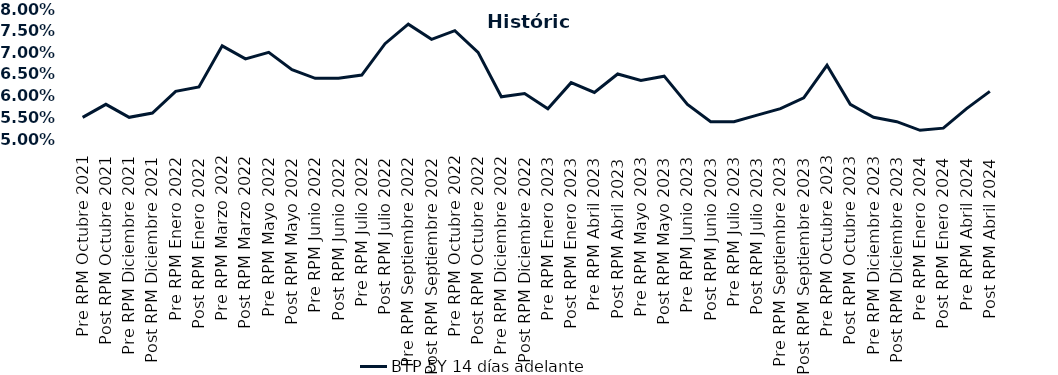
| Category | BTP 5Y 14 días adelante |
|---|---|
| Pre RPM Octubre 2021 | 0.055 |
| Post RPM Octubre 2021 | 0.058 |
| Pre RPM Diciembre 2021 | 0.055 |
| Post RPM Diciembre 2021 | 0.056 |
| Pre RPM Enero 2022 | 0.061 |
| Post RPM Enero 2022 | 0.062 |
| Pre RPM Marzo 2022 | 0.072 |
| Post RPM Marzo 2022 | 0.068 |
| Pre RPM Mayo 2022 | 0.07 |
| Post RPM Mayo 2022 | 0.066 |
| Pre RPM Junio 2022 | 0.064 |
| Post RPM Junio 2022 | 0.064 |
| Pre RPM Julio 2022 | 0.065 |
| Post RPM Julio 2022 | 0.072 |
| Pre RPM Septiembre 2022 | 0.076 |
| Post RPM Septiembre 2022 | 0.073 |
| Pre RPM Octubre 2022 | 0.075 |
| Post RPM Octubre 2022 | 0.07 |
| Pre RPM Diciembre 2022 | 0.06 |
| Post RPM Diciembre 2022 | 0.06 |
| Pre RPM Enero 2023 | 0.057 |
| Post RPM Enero 2023 | 0.063 |
| Pre RPM Abril 2023 | 0.061 |
| Post RPM Abril 2023 | 0.065 |
| Pre RPM Mayo 2023 | 0.064 |
| Post RPM Mayo 2023 | 0.064 |
| Pre RPM Junio 2023 | 0.058 |
| Post RPM Junio 2023 | 0.054 |
| Pre RPM Julio 2023 | 0.054 |
| Post RPM Julio 2023 | 0.056 |
| Pre RPM Septiembre 2023 | 0.057 |
| Post RPM Septiembre 2023 | 0.06 |
| Pre RPM Octubre 2023 | 0.067 |
| Post RPM Octubre 2023 | 0.058 |
| Pre RPM Diciembre 2023 | 0.055 |
| Post RPM Diciembre 2023 | 0.054 |
| Pre RPM Enero 2024 | 0.052 |
| Post RPM Enero 2024 | 0.052 |
| Pre RPM Abril 2024 | 0.057 |
| Post RPM Abril 2024 | 0.061 |